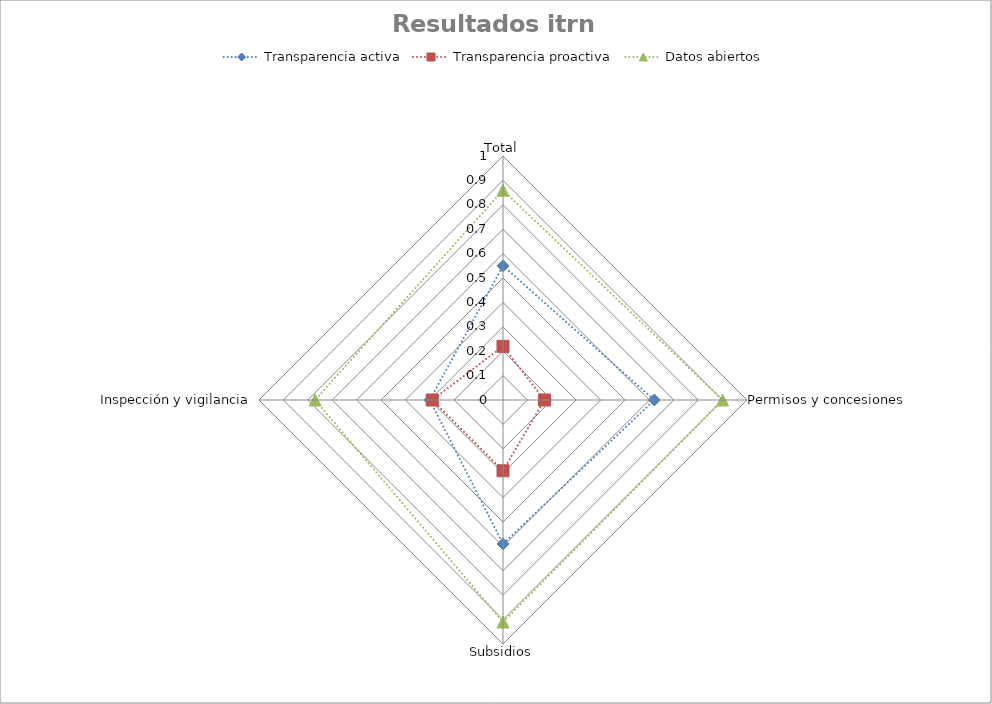
| Category | Transparencia activa | Transparencia proactiva | Datos abiertos |
|---|---|---|---|
| Total | 0.55 | 0.22 | 0.86 |
| Permisos y concesiones  | 0.62 | 0.17 | 0.9 |
| Subsidios | 0.59 | 0.29 | 0.91 |
| Inspección y vigilancia  | 0.3 | 0.29 | 0.77 |